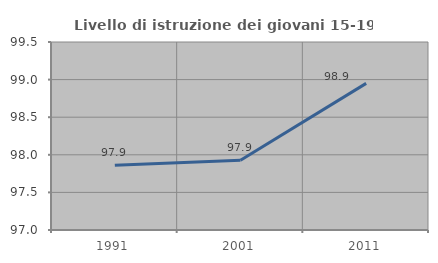
| Category | Livello di istruzione dei giovani 15-19 anni |
|---|---|
| 1991.0 | 97.861 |
| 2001.0 | 97.928 |
| 2011.0 | 98.95 |